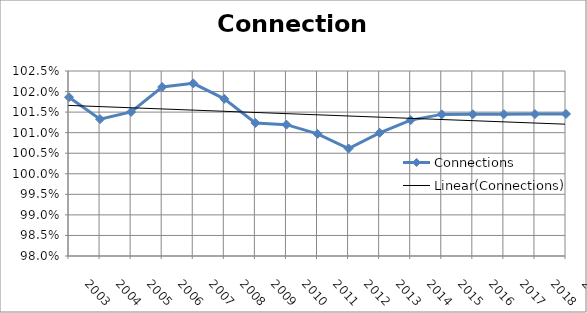
| Category | Connections |
|---|---|
| 2003.0 | 1.019 |
| 2004.0 | 1.013 |
| 2005.0 | 1.015 |
| 2006.0 | 1.021 |
| 2007.0 | 1.022 |
| 2008.0 | 1.018 |
| 2009.0 | 1.012 |
| 2010.0 | 1.012 |
| 2011.0 | 1.01 |
| 2012.0 | 1.006 |
| 2013.0 | 1.01 |
| 2014.0 | 1.013 |
| 2015.0 | 1.014 |
| 2016.0 | 1.014 |
| 2017.0 | 1.014 |
| 2018.0 | 1.015 |
| 2019.0 | 1.015 |